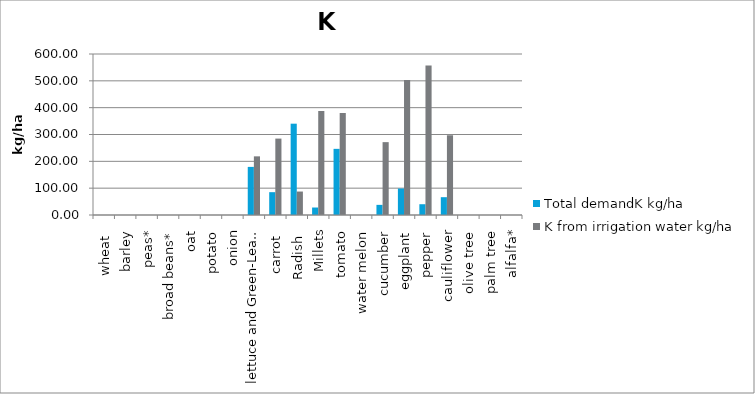
| Category | Total demandK kg/ha | K from irrigation water kg/ha |
|---|---|---|
| wheat  | 0 | 0 |
| barley | 0 | 0 |
| peas* | 0 | 0 |
| broad beans* | 0 | 0 |
| oat | 0 | 0 |
| potato | 0 | 0 |
| onion | 0 | 0 |
| lettuce and Green-Leaf Crops | 179.28 | 218.571 |
| carrot  | 85.075 | 284.754 |
| Radish  | 340.3 | 87.424 |
| Millets | 27.888 | 387.636 |
| tomato | 246.51 | 380.152 |
| water melon | 0 | 0 |
| cucumber | 37.765 | 271.528 |
| eggplant | 98.77 | 503.272 |
| pepper | 40.172 | 556.684 |
| cauliflower | 66.4 | 297.222 |
| olive tree | 0 | 0 |
| palm tree | 0 | 0 |
| alfalfa* | 0 | 0 |